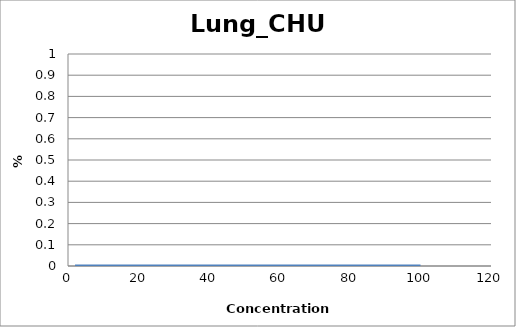
| Category | Lung_CHU2 |
|---|---|
| 100.0 | 0 |
| 50.0 | 0 |
| 20.0 | 0 |
| 2.0 | 0 |
| nan | 0 |
| nan | 0 |
| nan | 0 |
| nan | 0 |
| nan | 0 |